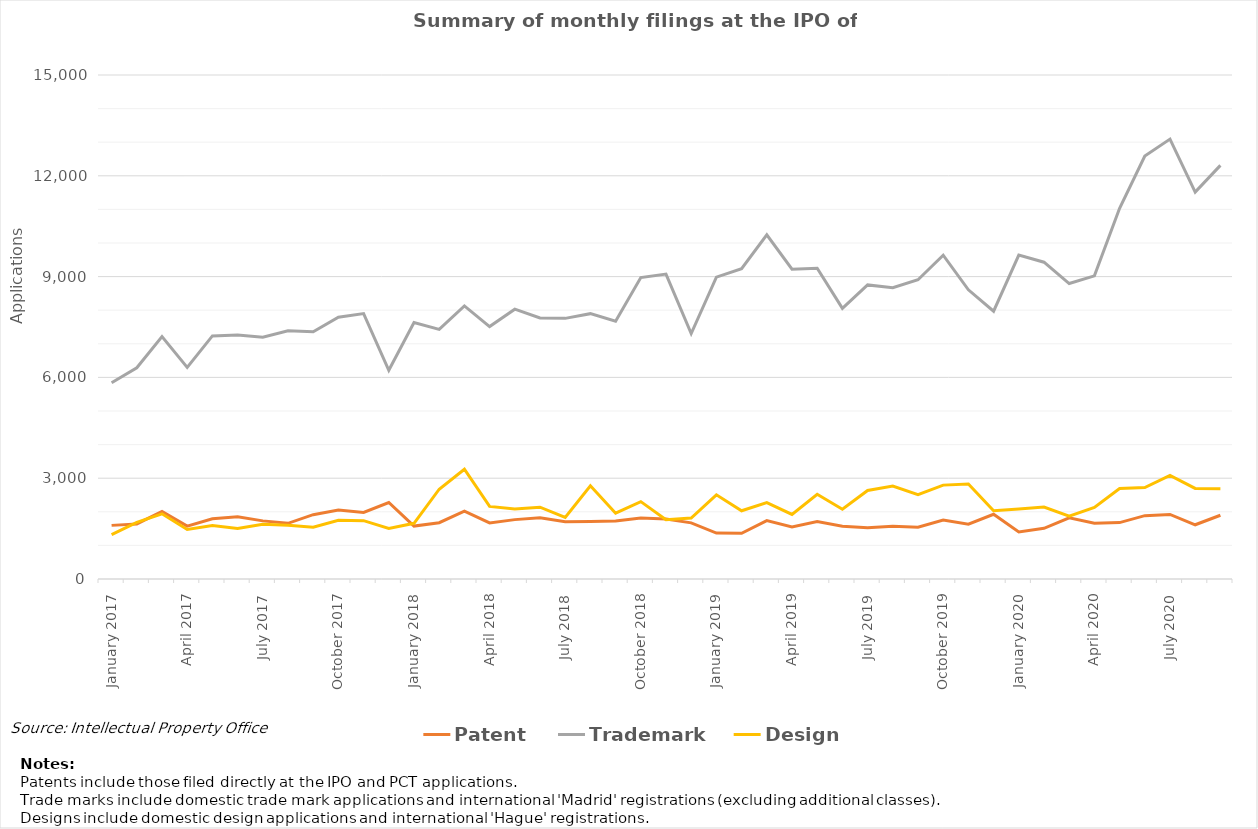
| Category | Patent | Trademark | Design |
|---|---|---|---|
| January 2017 | 1596 | 5843 | 1318 |
| February 2017 | 1640 | 6288 | 1687 |
| March 2017 | 2011 | 7214 | 1940 |
| April 2017 | 1573 | 6297 | 1474 |
| May 2017 | 1790 | 7234 | 1592 |
| June 2017 | 1853 | 7263 | 1502 |
| July 2017 | 1730 | 7197 | 1627 |
| August 2017 | 1657 | 7389 | 1600 |
| September 2017 | 1915 | 7359 | 1544 |
| October 2017 | 2055 | 7792 | 1745 |
| November 2017 | 1983 | 7901 | 1736 |
| December 2017 | 2277 | 6211 | 1507 |
| January 2018 | 1575 | 7634 | 1658 |
| February 2018 | 1676 | 7428 | 2672 |
| March 2018 | 2022 | 8127 | 3267 |
| April 2018 | 1670 | 7512 | 2160 |
| May 2018 | 1767 | 8030 | 2083 |
| June 2018 | 1821 | 7769 | 2136 |
| July 2018 | 1704 | 7757 | 1832 |
| August 2018 | 1713 | 7897 | 2777 |
| September 2018 | 1725 | 7673 | 1960 |
| October 2018 | 1818 | 8972 | 2302 |
| November 2018 | 1787 | 9076 | 1765 |
| December 2018 | 1670 | 7304 | 1815 |
| January 2019 | 1367 | 8983 | 2505 |
| February 2019 | 1361 | 9234 | 2031 |
| March 2019 | 1737 | 10244 | 2275 |
| April 2019 | 1552 | 9219 | 1923 |
| May 2019 | 1710 | 9251 | 2520 |
| June 2019 | 1570 | 8053 | 2074 |
| July 2019 | 1527 | 8752 | 2634 |
| August 2019 | 1572 | 8670 | 2768 |
| September 2019 | 1540 | 8907 | 2511 |
| October 2019 | 1755 | 9636 | 2794 |
| November 2019 | 1629 | 8607 | 2827 |
| December 2019 | 1927 | 7970 | 2034 |
| January 2020 | 1400 | 9642 | 2082 |
| February 2020 | 1509 | 9428 | 2143 |
| March 2020 | 1820 | 8794 | 1871 |
| April 2020 | 1658 | 9021 | 2127 |
| May 2020 | 1678 | 11034 | 2694 |
| June 2020 | 1886 | 12590 | 2721 |
| July 2020 | 1921 | 13092 | 3086 |
| August 2020 | 1614 | 11515 | 2695 |
| September 2020 | 1898 | 12311 | 2685 |